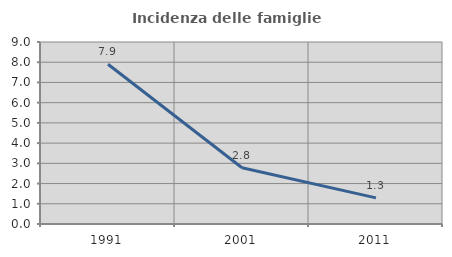
| Category | Incidenza delle famiglie numerose |
|---|---|
| 1991.0 | 7.901 |
| 2001.0 | 2.784 |
| 2011.0 | 1.292 |